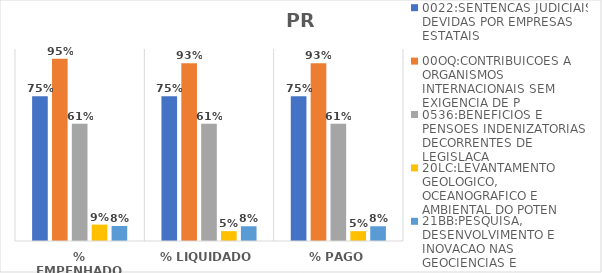
| Category | 0022:SENTENCAS JUDICIAIS DEVIDAS POR EMPRESAS ESTATAIS | 00OQ:CONTRIBUICOES A ORGANISMOS INTERNACIONAIS SEM EXIGENCIA DE P | 0536:BENEFICIOS E PENSOES INDENIZATORIAS DECORRENTES DE LEGISLACA | 20LC:LEVANTAMENTO GEOLOGICO, OCEANOGRAFICO E AMBIENTAL DO POTEN | 21BB:PESQUISA, DESENVOLVIMENTO E INOVACAO NAS GEOCIENCIAS E |
|---|---|---|---|---|---|
| % EMPENHADO | 0.754 | 0.95 | 0.611 | 0.085 | 0.078 |
| % LIQUIDADO | 0.754 | 0.926 | 0.611 | 0.051 | 0.077 |
| % PAGO | 0.754 | 0.926 | 0.611 | 0.051 | 0.077 |